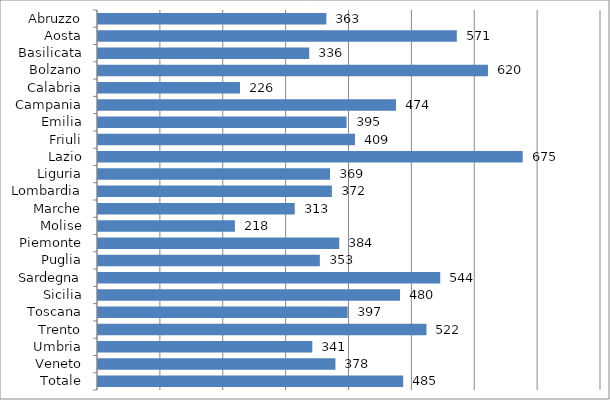
| Category | Series 0 |
|---|---|
| Abruzzo | 363.223 |
| Aosta | 570.691 |
| Basilicata | 335.944 |
| Bolzano | 620.2 |
| Calabria | 225.804 |
| Campania | 473.904 |
| Emilia | 395.346 |
| Friuli | 408.745 |
| Lazio | 675.459 |
| Liguria | 369.001 |
| Lombardia | 371.965 |
| Marche | 312.867 |
| Molise | 217.728 |
| Piemonte | 383.688 |
| Puglia | 352.849 |
| Sardegna | 544.266 |
| Sicilia | 480.368 |
| Toscana | 397.036 |
| Trento | 522.431 |
| Umbria | 340.858 |
| Veneto | 377.624 |
| Totale | 485.367 |